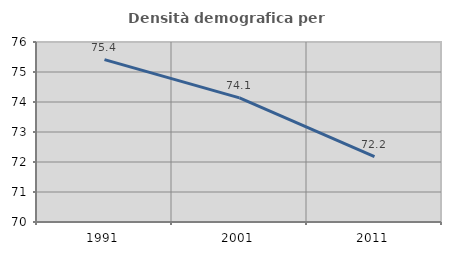
| Category | Densità demografica |
|---|---|
| 1991.0 | 75.414 |
| 2001.0 | 74.139 |
| 2011.0 | 72.178 |